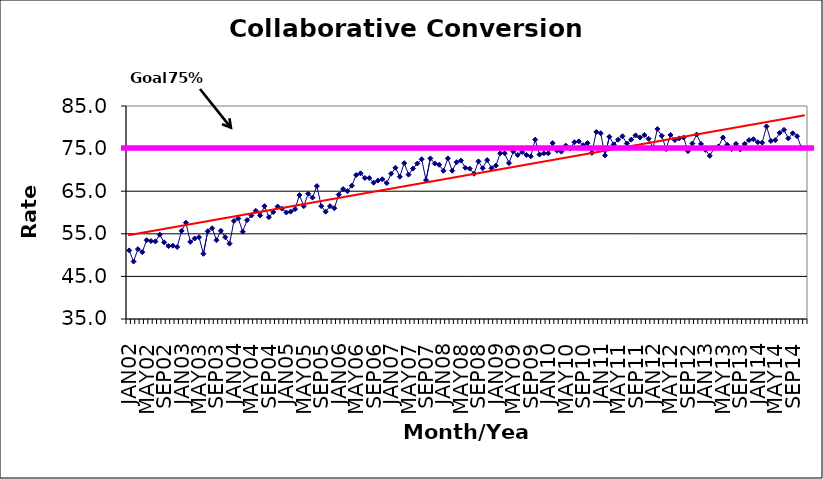
| Category | Series 0 |
|---|---|
| JAN02 | 51.1 |
| FEB02 | 48.5 |
| MAR02 | 51.4 |
| APR02 | 50.7 |
| MAY02 | 53.5 |
| JUN02 | 53.3 |
| JUL02 | 53.2 |
| AUG02 | 54.8 |
| SEP02 | 53 |
| OCT02 | 52.1 |
| NOV02 | 52.2 |
| DEC02 | 51.9 |
| JAN03 | 55.7 |
| FEB03 | 57.6 |
| MAR03 | 53.1 |
| APR03 | 53.9 |
| MAY03 | 54.2 |
| JUN03 | 50.3 |
| JUL03 | 55.6 |
| AUG03 | 56.3 |
| SEP03 | 53.5 |
| OCT03 | 55.7 |
| NOV03 | 54.2 |
| DEC03 | 52.7 |
| JAN04 | 58 |
| FEB04 | 58.6 |
| MAR04 | 55.5 |
| APR04 | 58.2 |
| MAY04 | 59.3 |
| JUN04 | 60.4 |
| JUL04 | 59.3 |
| AUG04 | 61.5 |
| SEP04 | 58.9 |
| OCT04 | 60.1 |
| NOV04 | 61.4 |
| DEC04 | 60.9 |
| JAN05 | 60 |
| FEB05 | 60.2 |
| MAR05 | 60.8 |
| APR05 | 64.1 |
| MAY05 | 61.5 |
| JUN05 | 64.4 |
| JUL05 | 63.5 |
| AUG05 | 66.2 |
| SEP05 | 61.5 |
| OCT05 | 60.2 |
| NOV05 | 61.5 |
| DEC05 | 61 |
| JAN06 | 64.2 |
| FEB06 | 65.5 |
| MAR06 | 65 |
| APR06 | 66.3 |
| MAY06 | 68.8 |
| JUN06 | 69.2 |
| JUL06 | 68.1 |
| AUG06 | 68.1 |
| SEP06 | 67 |
| OCT06 | 67.5 |
| NOV06 | 67.8 |
| DEC06 | 66.9 |
| JAN07 | 69.1 |
| FEB07 | 70.5 |
| MAR07 | 68.4 |
| APR07 | 71.6 |
| MAY07 | 68.9 |
| JUN07 | 70.3 |
| JUL07 | 71.5 |
| AUG07 | 72.5 |
| SEP07 | 67.6 |
| OCT07 | 72.7 |
| NOV07 | 71.5 |
| DEC07 | 71.2 |
| JAN08 | 69.8 |
| FEB08 | 72.7 |
| MAR08 | 69.8 |
| APR08 | 71.8 |
| MAY08 | 72.2 |
| JUN08 | 70.5 |
| JUL08 | 70.3 |
| AUG08 | 69.1 |
| SEP08 | 72 |
| OCT08 | 70.4 |
| NOV08 | 72.3 |
| DEC08 | 70.4 |
| JAN09 | 71 |
| FEB09 | 73.9 |
| MAR09 | 73.9 |
| APR09 | 71.6 |
| MAY09 | 74.3 |
| JUN09 | 73.5 |
| JUL09 | 74.2 |
| AUG09 | 73.5 |
| SEP09 | 73.2 |
| OCT09 | 77.1 |
| NOV09 | 73.6 |
| DEC09 | 73.9 |
| JAN10 | 73.9 |
| FEB10 | 76.3 |
| MAR10 | 74.5 |
| APR10 | 74.3 |
| MAY10 | 75.7 |
| JUN10 | 75 |
| JUL10 | 76.5 |
| AUG10 | 76.7 |
| SEP10 | 75.8 |
| OCT10 | 76.3 |
| NOV10 | 74 |
| DEC10 | 78.9 |
| JAN11 | 78.6 |
| FEB11 | 73.4 |
| MAR11 | 77.8 |
| APR11 | 76 |
| MAY11 | 77.1 |
| JUN11 | 77.9 |
| JUL11 | 76.2 |
| AUG11 | 77.1 |
| SEP11 | 78.1 |
| OCT11 | 77.6 |
| NOV11 | 78.2 |
| DEC11 | 77.3 |
| JAN12 | 75.1 |
| FEB12 | 79.6 |
| MAR12 | 78 |
| APR12 | 74.9 |
| MAY12 | 78.2 |
| JUN12 | 77 |
| JUL12 | 77.4 |
| AUG12 | 77.6 |
| SEP12 | 74.4 |
| OCT12 | 76.2 |
| NOV12 | 78.3 |
| DEC12 | 76.1 |
| JAN13 | 74.7 |
| FEB13 | 73.3 |
| MAR13 | 75.1 |
| APR13 | 75.5 |
| MAY13 | 77.6 |
| JUN13 | 75.9 |
| JUL13 | 74.9 |
| AUG13 | 76.1 |
| SEP13 | 74.8 |
| OCT13 | 76.1 |
| NOV13 | 77 |
| DEC13 | 77.2 |
| JAN14 | 76.5 |
| FEB14 | 76.4 |
| MAR14 | 80.2 |
| APR14 | 76.8 |
| MAY14 | 77 |
| JUN14 | 78.7 |
| JUL14 | 79.4 |
| AUG14 | 77.4 |
| SEP14 | 78.6 |
| OCT14 | 77.9 |
| NOV14 | 75.2 |